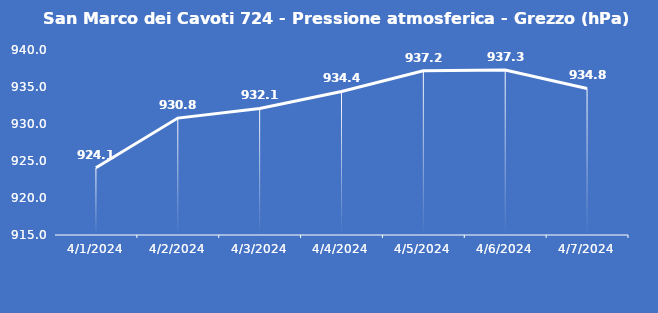
| Category | San Marco dei Cavoti 724 - Pressione atmosferica - Grezzo (hPa) |
|---|---|
| 4/1/24 | 924.1 |
| 4/2/24 | 930.8 |
| 4/3/24 | 932.1 |
| 4/4/24 | 934.4 |
| 4/5/24 | 937.2 |
| 4/6/24 | 937.3 |
| 4/7/24 | 934.8 |